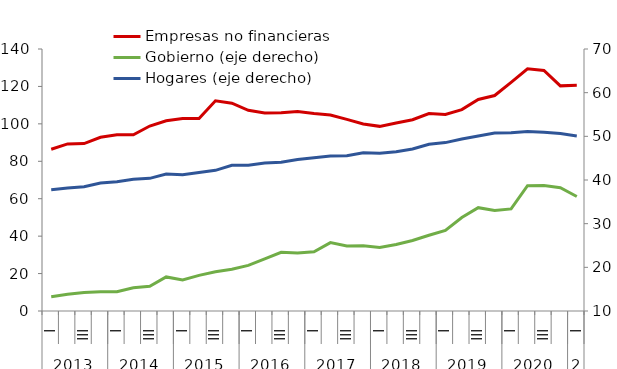
| Category | Empresas no financieras  |
|---|---|
| 0 | 86.416 |
| 1 | 89.277 |
| 2 | 89.489 |
| 3 | 92.835 |
| 4 | 94.115 |
| 5 | 94.154 |
| 6 | 98.837 |
| 7 | 101.652 |
| 8 | 102.915 |
| 9 | 102.891 |
| 10 | 112.309 |
| 11 | 111.061 |
| 12 | 107.236 |
| 13 | 105.842 |
| 14 | 105.94 |
| 15 | 106.547 |
| 16 | 105.526 |
| 17 | 104.752 |
| 18 | 102.37 |
| 19 | 99.96 |
| 20 | 98.663 |
| 21 | 100.506 |
| 22 | 102.205 |
| 23 | 105.524 |
| 24 | 105.053 |
| 25 | 107.613 |
| 26 | 113.03 |
| 27 | 115.153 |
| 28 | 122.189 |
| 29 | 129.419 |
| 30 | 128.524 |
| 31 | 120.301 |
| 32 | 120.564 |